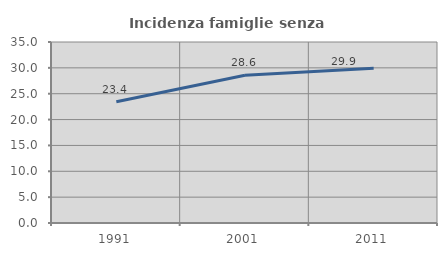
| Category | Incidenza famiglie senza nuclei |
|---|---|
| 1991.0 | 23.445 |
| 2001.0 | 28.571 |
| 2011.0 | 29.93 |